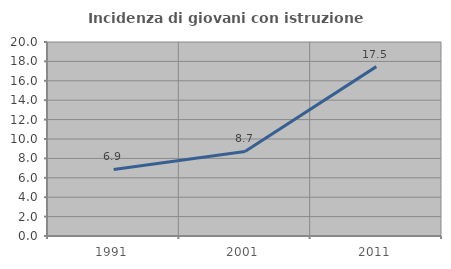
| Category | Incidenza di giovani con istruzione universitaria |
|---|---|
| 1991.0 | 6.856 |
| 2001.0 | 8.713 |
| 2011.0 | 17.46 |